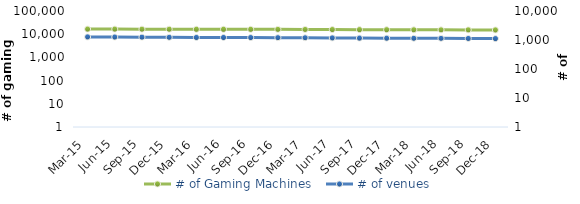
| Category | # of Gaming Machines  |
|---|---|
| Mar-15 | 16614 |
| Jun-15 | 16579 |
| Sep-15 | 16440 |
| Dec-15 | 16393 |
| Mar-16 | 16274 |
| Jun-16 | 16250 |
| Sep-16 | 16221 |
| Dec-16 | 16148 |
| Mar-17 | 16031 |
| Jun-17 | 15858 |
| Sep-17 | 15717 |
| Dec-17 | 15632 |
| Mar-18 | 15490 |
| Jun-18 | 15420 |
| Sep-18 | 15342 |
| Dec-18 | 15257 |